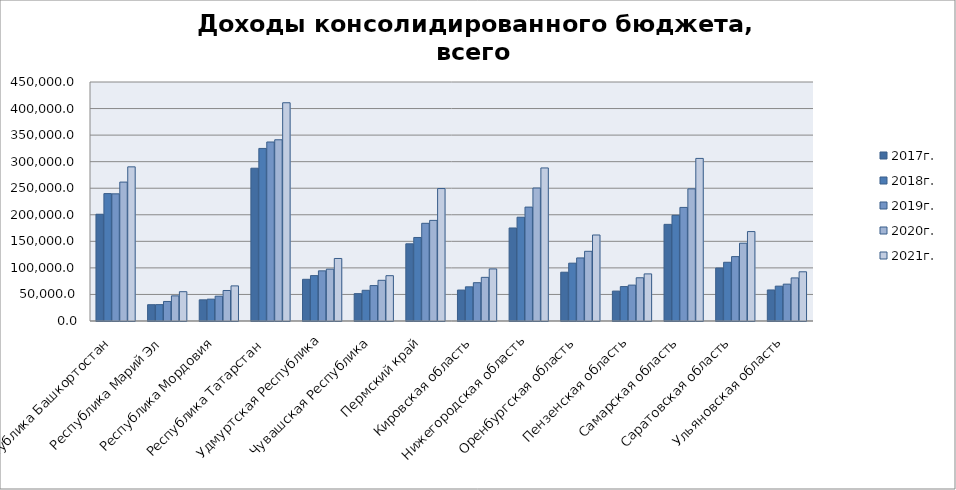
| Category | 2016г. | 2017г. | 2018г. | 2019г. | 2020г. | 2021г. |
|---|---|---|---|---|---|---|
| Республика Башкортостан |  | 201001.232 | 239885.648 | 239425.347 | 261542.816 | 290224.429 |
| Республика Марий Эл |  | 30692.772 | 30821.582 | 36792.49 | 47346.297 | 55162.114 |
| Республика Мордовия |  | 39853.418 | 41149.412 | 46741.297 | 57433.378 | 66107.337 |
| Республика Татарстан  |  | 287664.017 | 324919.328 | 337044.286 | 341217.006 | 410945.831 |
| Удмуртская Республика |  | 78505.848 | 85440.62 | 94416.383 | 97609.987 | 117721.813 |
| Чувашская Республика |  | 51497.202 | 57790.513 | 66684.885 | 76614.1 | 85336.679 |
| Пермский край |  | 145352.92 | 157250.75 | 183945.186 | 189436.505 | 249384.419 |
| Кировская область |  | 58268.922 | 64349.12 | 72111.438 | 82180.077 | 98046.317 |
| Нижегородская область |  | 175161.393 | 195412.892 | 214459.894 | 250378.73 | 288163.678 |
| Оренбургская область |  | 91871.303 | 108900.738 | 118742.082 | 131218.408 | 161941.837 |
| Пензенская область |  | 56326.201 | 64808.761 | 67584.454 | 81382.742 | 88691.439 |
| Самарская область |  | 181960.149 | 198965.461 | 213871.843 | 248778.327 | 306133.621 |
| Саратовская область |  | 99722.286 | 110567.076 | 121262.03 | 146440.767 | 168373.634 |
| Ульяновская область |  | 58438.819 | 65613.193 | 69374.176 | 81131.24 | 92648.361 |